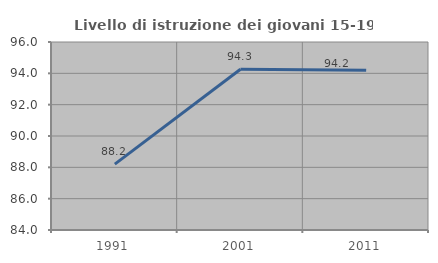
| Category | Livello di istruzione dei giovani 15-19 anni |
|---|---|
| 1991.0 | 88.203 |
| 2001.0 | 94.256 |
| 2011.0 | 94.197 |